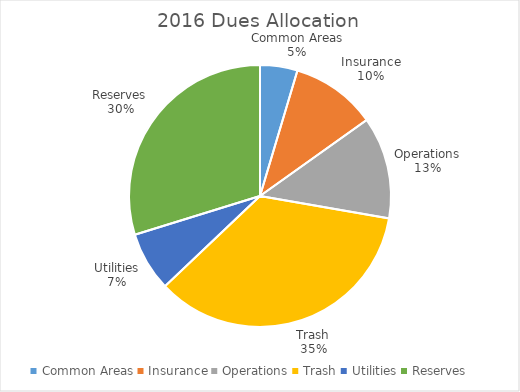
| Category | 2016 Owner |
|---|---|
| Common Areas | 19.372 |
| Insurance | 44.209 |
| Operations | 52.866 |
| Trash | 147.674 |
| Utilities | 30.698 |
| Reserves | 125 |